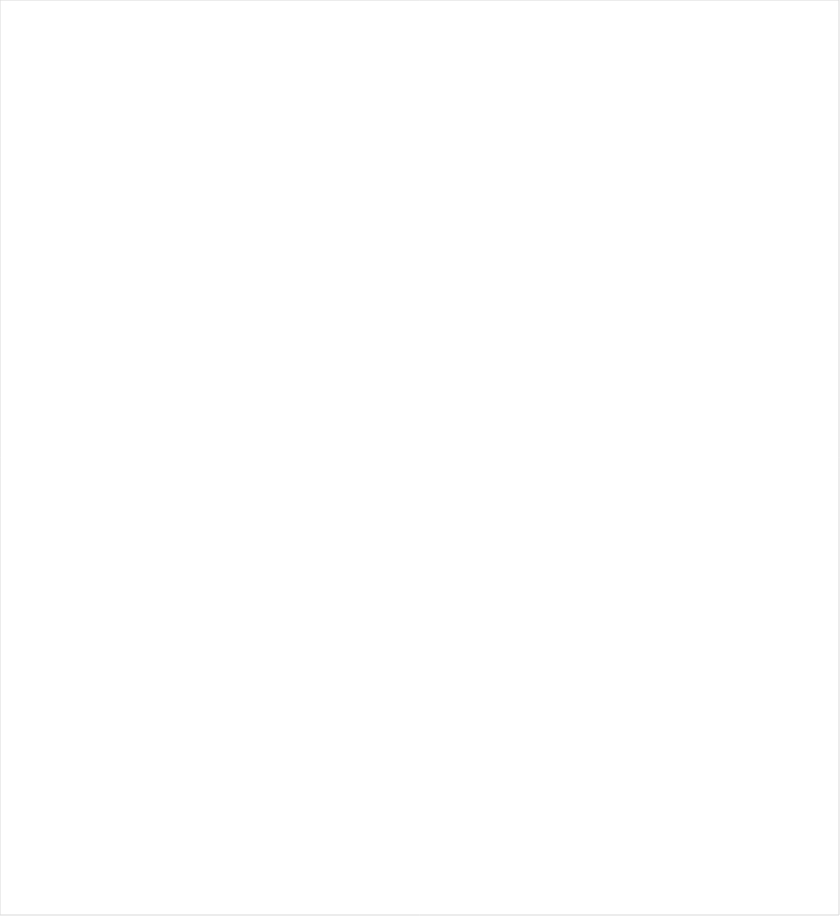
| Category | 2012 | 2013 | 2014 | 2015 | 2016 | 2017 | 2018 | 2019 | 2020 | 2021 |
|---|---|---|---|---|---|---|---|---|---|---|
| Maken van een afspraak voor het spreekuur | 60257 | 61873 | 48492 | 56263 | 59907 | 51800 | 45442 | 40105 | 9438 | 5720 |
| Reguliere verwijzing naar advocaat  | 58532 | 48952 | 40891 | 37025 | 35711 | 33704 | 33817 | 34853 | 18185 | 12863 |
| Terugverwijzing naar advocaat | 46756 | 84118 | 89123 | 91177 | 93397 | 93081 | 87505 | 81195 | 21886 | 1752 |
| Verstrekken van informatie | 789389 | 915634 | 822243 | 626116 | 677276 | 680352 | 677968 | 666811 | 247272 | 199410 |
| Verwijzing naar ketenpartner  | 31599 | 29157 | 26122 | 19867 | 21583 | 19354 | 18197 | 17931 | 1209 | 0 |
| Verwijzing naar mediator  | 2635 | 2805 | 2823 | 1980 | 1679 | 1605 | 473 | 1029 | 0 | 0 |